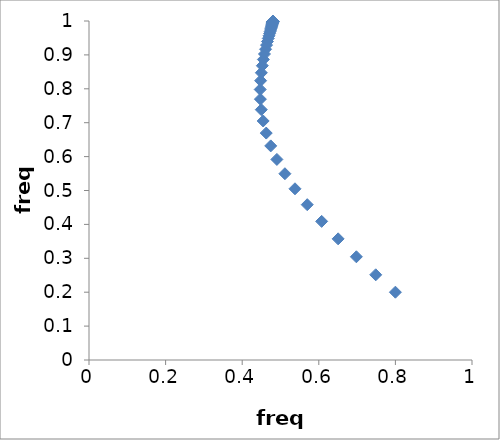
| Category | freq B |
|---|---|
| 0.8 | 0.2 |
| 0.748648648648648 | 0.251 |
| 0.698078316519268 | 0.304 |
| 0.650485917957528 | 0.357 |
| 0.607423496495288 | 0.409 |
| 0.56976208900994 | 0.458 |
| 0.537817236635363 | 0.505 |
| 0.511519012259172 | 0.549 |
| 0.49055596579327 | 0.592 |
| 0.474472344947467 | 0.632 |
| 0.462726311980724 | 0.669 |
| 0.454725583227716 | 0.705 |
| 0.44985461161577 | 0.738 |
| 0.447500947807586 | 0.769 |
| 0.447081989735361 | 0.798 |
| 0.448069303387657 | 0.824 |
| 0.450006748618154 | 0.847 |
| 0.452520025099778 | 0.868 |
| 0.455317507358315 | 0.887 |
| 0.458184088697208 | 0.903 |
| 0.460970618966744 | 0.917 |
| 0.463581468834547 | 0.929 |
| 0.465962166210549 | 0.939 |
| 0.468088314530942 | 0.949 |
| 0.469956360883731 | 0.956 |
| 0.471576328535832 | 0.963 |
| 0.472966361160071 | 0.969 |
| 0.474148801310775 | 0.973 |
| 0.475147493298186 | 0.977 |
| 0.475986019589622 | 0.981 |
| 0.47668662213018 | 0.984 |
| 0.477269608609041 | 0.986 |
| 0.477753089744953 | 0.988 |
| 0.478152933194785 | 0.99 |
| 0.478482851631431 | 0.992 |
| 0.478754567278478 | 0.993 |
| 0.478978013737631 | 0.994 |
| 0.479161549475971 | 0.995 |
| 0.479312166967417 | 0.996 |
| 0.479435688164687 | 0.996 |
| 0.479536941492714 | 0.997 |
| 0.47961991850921 | 0.997 |
| 0.479687910233518 | 0.998 |
| 0.479743624242185 | 0.998 |
| 0.47978928421645 | 0.998 |
| 0.479826713879542 | 0.999 |
| 0.479857407303706 | 0.999 |
| 0.479882587482955 | 0.999 |
| 0.479903254914605 | 0.999 |
| 0.479920227747781 | 0.999 |
| 0.479934174864001 | 0.999 |